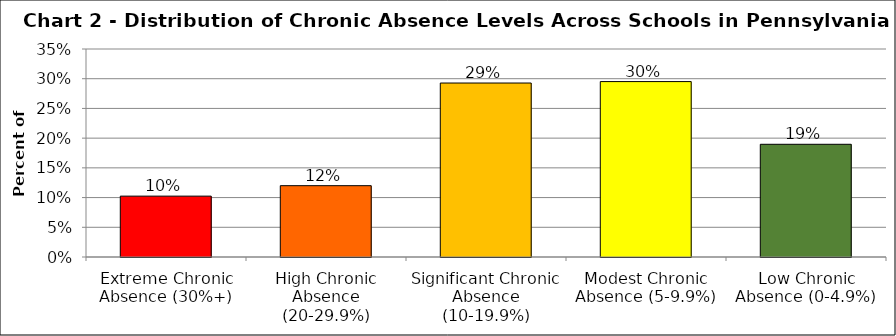
| Category | Series 1 |
|---|---|
| Extreme Chronic Absence (30%+) | 0.102 |
| High Chronic Absence (20-29.9%) | 0.12 |
| Significant Chronic Absence (10-19.9%) | 0.293 |
| Modest Chronic Absence (5-9.9%) | 0.295 |
| Low Chronic Absence (0-4.9%) | 0.19 |